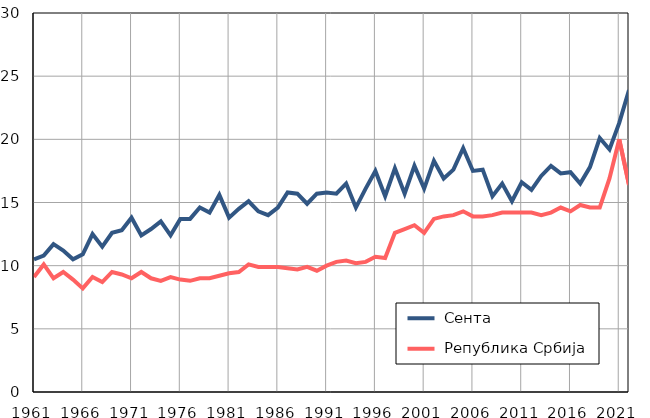
| Category |  Сента |  Република Србија |
|---|---|---|
| 1961.0 | 10.5 | 9.1 |
| 1962.0 | 10.8 | 10.1 |
| 1963.0 | 11.7 | 9 |
| 1964.0 | 11.2 | 9.5 |
| 1965.0 | 10.5 | 8.9 |
| 1966.0 | 10.9 | 8.2 |
| 1967.0 | 12.5 | 9.1 |
| 1968.0 | 11.5 | 8.7 |
| 1969.0 | 12.6 | 9.5 |
| 1970.0 | 12.8 | 9.3 |
| 1971.0 | 13.8 | 9 |
| 1972.0 | 12.4 | 9.5 |
| 1973.0 | 12.9 | 9 |
| 1974.0 | 13.5 | 8.8 |
| 1975.0 | 12.4 | 9.1 |
| 1976.0 | 13.7 | 8.9 |
| 1977.0 | 13.7 | 8.8 |
| 1978.0 | 14.6 | 9 |
| 1979.0 | 14.2 | 9 |
| 1980.0 | 15.6 | 9.2 |
| 1981.0 | 13.8 | 9.4 |
| 1982.0 | 14.5 | 9.5 |
| 1983.0 | 15.1 | 10.1 |
| 1984.0 | 14.3 | 9.9 |
| 1985.0 | 14 | 9.9 |
| 1986.0 | 14.6 | 9.9 |
| 1987.0 | 15.8 | 9.8 |
| 1988.0 | 15.7 | 9.7 |
| 1989.0 | 14.9 | 9.9 |
| 1990.0 | 15.7 | 9.6 |
| 1991.0 | 15.8 | 10 |
| 1992.0 | 15.7 | 10.3 |
| 1993.0 | 16.5 | 10.4 |
| 1994.0 | 14.6 | 10.2 |
| 1995.0 | 16.1 | 10.3 |
| 1996.0 | 17.5 | 10.7 |
| 1997.0 | 15.5 | 10.6 |
| 1998.0 | 17.7 | 12.6 |
| 1999.0 | 15.7 | 12.9 |
| 2000.0 | 17.9 | 13.2 |
| 2001.0 | 16.1 | 12.6 |
| 2002.0 | 18.3 | 13.7 |
| 2003.0 | 16.9 | 13.9 |
| 2004.0 | 17.6 | 14 |
| 2005.0 | 19.3 | 14.3 |
| 2006.0 | 17.5 | 13.9 |
| 2007.0 | 17.6 | 13.9 |
| 2008.0 | 15.5 | 14 |
| 2009.0 | 16.5 | 14.2 |
| 2010.0 | 15.1 | 14.2 |
| 2011.0 | 16.6 | 14.2 |
| 2012.0 | 16 | 14.2 |
| 2013.0 | 17.1 | 14 |
| 2014.0 | 17.9 | 14.2 |
| 2015.0 | 17.3 | 14.6 |
| 2016.0 | 17.4 | 14.3 |
| 2017.0 | 16.5 | 14.8 |
| 2018.0 | 17.8 | 14.6 |
| 2019.0 | 20.1 | 14.6 |
| 2020.0 | 19.2 | 16.9 |
| 2021.0 | 21.3 | 20 |
| 2022.0 | 23.9 | 16.4 |